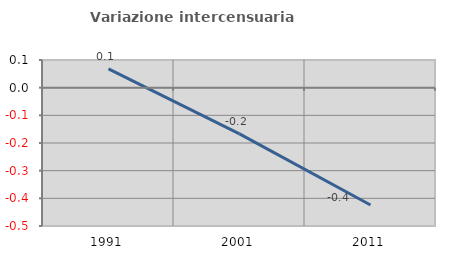
| Category | Variazione intercensuaria annua |
|---|---|
| 1991.0 | 0.068 |
| 2001.0 | -0.167 |
| 2011.0 | -0.424 |